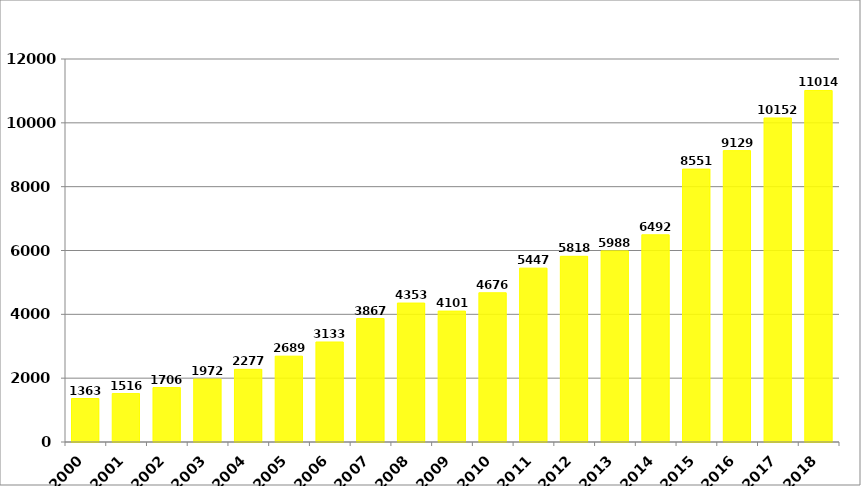
| Category | მშპ ერთ სულზე (ლარი) |
|---|---|
| 2000.0 | 1362.522 |
| 2001.0 | 1516.335 |
| 2002.0 | 1705.599 |
| 2003.0 | 1972.112 |
| 2004.0 | 2276.672 |
| 2005.0 | 2689.099 |
| 2006.0 | 3133.145 |
| 2007.0 | 3866.88 |
| 2008.0 | 4352.902 |
| 2009.0 | 4101.326 |
| 2010.0 | 4675.72 |
| 2011.0 | 5447.057 |
| 2012.0 | 5818.055 |
| 2013.0 | 5987.634 |
| 2014.0 | 6491.589 |
| 2015.0 | 8550.921 |
| 2016.0 | 9129.016 |
| 2017.0 | 10151.98 |
| 2018.0 | 11013.904 |